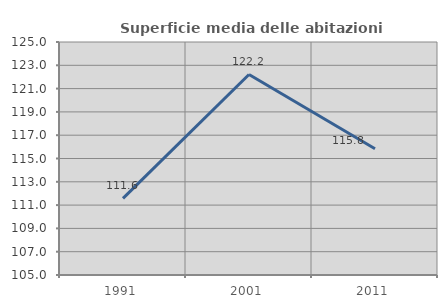
| Category | Superficie media delle abitazioni occupate |
|---|---|
| 1991.0 | 111.581 |
| 2001.0 | 122.211 |
| 2011.0 | 115.843 |